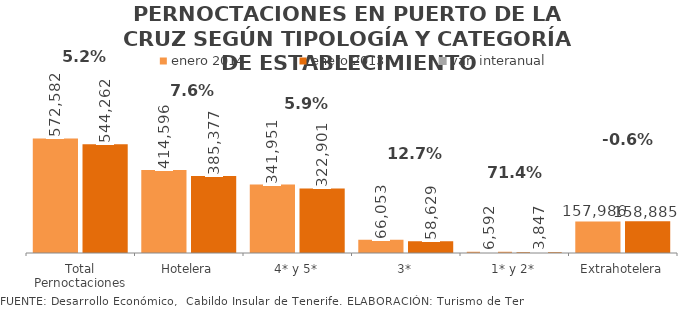
| Category | enero 2014 | enero 2013 |
|---|---|---|
| Total Pernoctaciones | 572582 | 544262 |
| Hotelera | 414596 | 385377 |
| 4* y 5* | 341951 | 322901 |
| 3* | 66053 | 58629 |
| 1* y 2* | 6592 | 3847 |
| Extrahotelera | 157986 | 158885 |